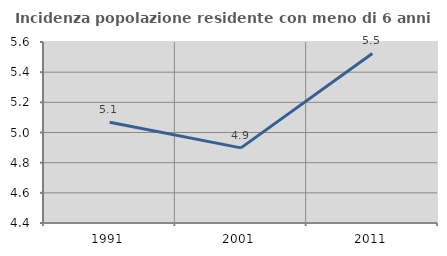
| Category | Incidenza popolazione residente con meno di 6 anni |
|---|---|
| 1991.0 | 5.068 |
| 2001.0 | 4.898 |
| 2011.0 | 5.524 |